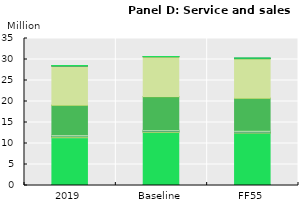
| Category | Agriculture and food | Business services | Construction | Dwellings | Electric equipment | Fossil fuels | Hydro power | Land transport | Minerals n.e.s. | Nuclear power | Other Manufacturing | Other services | Power transm. & distr. | Public services | Solar power | Transport equipement | Water collection and distr. | Wind power |
|---|---|---|---|---|---|---|---|---|---|---|---|---|---|---|---|---|---|---|
| 2019 | 0.2 | 11.193 | 0.069 | 0.038 | 0.07 | 0.025 | 0.005 | 0.155 | 0.013 | 0.004 | 0.389 | 6.97 | 0.026 | 9.253 | 0.001 | 0.095 | 0.035 | 0.003 |
| Baseline | 0.208 | 12.431 | 0.071 | 0.046 | 0.062 | 0.014 | 0.005 | 0.163 | 0.013 | 0.003 | 0.329 | 7.811 | 0.026 | 9.427 | 0.002 | 0.087 | 0.036 | 0.006 |
| FF55 | 0.205 | 12.235 | 0.071 | 0.046 | 0.064 | 0.005 | 0.004 | 0.155 | 0.012 | 0.003 | 0.33 | 7.666 | 0.023 | 9.373 | 0.003 | 0.088 | 0.036 | 0.008 |